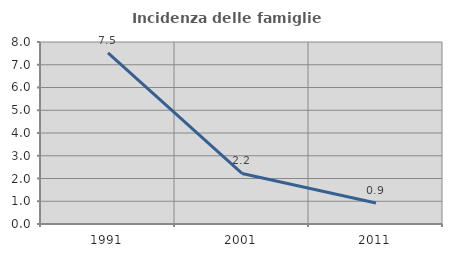
| Category | Incidenza delle famiglie numerose |
|---|---|
| 1991.0 | 7.518 |
| 2001.0 | 2.222 |
| 2011.0 | 0.92 |